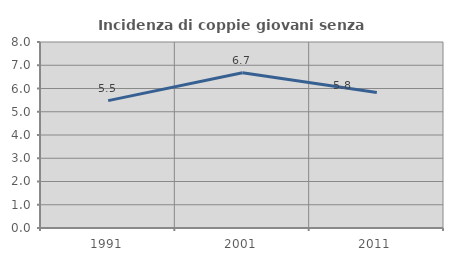
| Category | Incidenza di coppie giovani senza figli |
|---|---|
| 1991.0 | 5.479 |
| 2001.0 | 6.675 |
| 2011.0 | 5.83 |